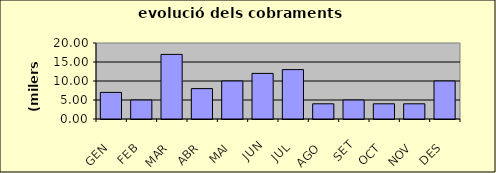
| Category | Series 0 |
|---|---|
| GEN | 7 |
| FEB | 5 |
| MAR | 17 |
| ABR | 8 |
| MAI | 10 |
| JUN | 12 |
| JUL | 13 |
| AGO | 4 |
| SET | 5 |
| OCT | 4 |
| NOV | 4 |
| DES | 10 |